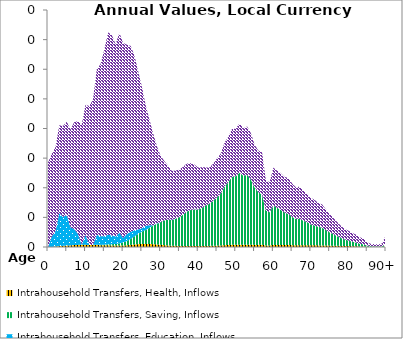
| Category | Intrahousehold Transfers, Health, Inflows | Intrahousehold Transfers, Saving, Inflows | Intrahousehold Transfers, Education, Inflows | Intrahousehold Transfers, Consumption other than health and education, Inflows |
|---|---|---|---|---|
| 0 | 0 | 0 | 0 | 57.008 |
|  | 0 | 0 | 6.996 | 56 |
| 2 | 0.304 | 0 | 10.42 | 56.77 |
| 3 | 0.58 | 0 | 22.255 | 59.377 |
| 4 | 0.795 | 0 | 19.421 | 61.508 |
| 5 | 0.945 | 0 | 20.78 | 62.879 |
| 6 | 1.107 | 0 | 12.098 | 66.08 |
| 7 | 1.302 | 0 | 10.794 | 72.364 |
| 8 | 1.428 | 0 | 7.303 | 76.206 |
| 9 | 1.516 | 0 | 0 | 81.371 |
| 10 | 1.464 | 0 | 6.757 | 87.924 |
| 11 | 1.379 | 0.012 | 0 | 93.714 |
| 12 | 1.32 | 0.086 | 0 | 98.562 |
| 13 | 1.335 | 0.176 | 6.635 | 111.996 |
| 14 | 1.219 | 0.261 | 5.818 | 116.21 |
| 15 | 1.162 | 0.426 | 5.702 | 126.046 |
| 16 | 1.146 | 0.656 | 6.451 | 136.65 |
| 17 | 1.04 | 0.88 | 5.891 | 135.256 |
| 18 | 0.927 | 1.089 | 5.091 | 129.776 |
| 19 | 0.958 | 1.483 | 7.252 | 134.942 |
| 20 | 0.986 | 2.047 | 3.089 | 131.748 |
| 21 | 1.128 | 2.874 | 4.789 | 127.779 |
| 22 | 1.422 | 4.061 | 4.749 | 125.515 |
| 23 | 1.713 | 5.453 | 4.144 | 118.094 |
| 24 | 1.927 | 6.87 | 3.127 | 106.806 |
| 25 | 2.043 | 8.339 | 2.199 | 95.618 |
| 26 | 2.002 | 9.411 | 2.874 | 81.547 |
| 27 | 1.988 | 10.897 | 1.85 | 71.392 |
| 28 | 1.919 | 12.623 | 0.034 | 62.213 |
| 29 | 1.709 | 13.852 | 0.337 | 52.073 |
| 30 | 1.479 | 15.27 | 0 | 44.852 |
| 31 | 1.24 | 16.767 | 0 | 39.969 |
| 32 | 1.023 | 17.469 | 0 | 36.294 |
| 33 | 0.842 | 17.258 | 0.267 | 32.933 |
| 34 | 0.775 | 18.349 | 0 | 32.572 |
| 35 | 0.74 | 19.373 | 0 | 32.037 |
| 36 | 0.74 | 21.199 | 0 | 32.346 |
| 37 | 0.731 | 23.184 | 0.034 | 32.455 |
| 38 | 0.703 | 24.304 | 0 | 31.588 |
| 39 | 0.681 | 24.65 | 0 | 30.257 |
| 40 | 0.671 | 24.588 | 0 | 28.394 |
| 41 | 0.708 | 25.722 | 0 | 27.378 |
| 42 | 0.735 | 27.269 | 0 | 25.75 |
| 43 | 0.76 | 28.368 | 0 | 24.565 |
| 44 | 0.833 | 30.424 | 0 | 25.106 |
| 45 | 0.926 | 32.633 | 0 | 26.22 |
| 46 | 1.036 | 34.912 | 0 | 27.13 |
| 47 | 1.231 | 39.545 | 0 | 29.611 |
| 48 | 1.354 | 42.379 | 0 | 30.637 |
| 49 | 1.487 | 45.958 | 0 | 32.19 |
| 50 | 1.519 | 46.294 | 0 | 32.035 |
| 51 | 1.592 | 48.589 | 0 | 33.393 |
| 52 | 1.524 | 46.618 | 0 | 31.966 |
| 53 | 1.575 | 47.148 | 0 | 32.656 |
| 54 | 1.527 | 44.116 | 0 | 31.361 |
| 55 | 1.434 | 38.866 | 0 | 28.84 |
| 56 | 1.428 | 35.536 | 0 | 28.128 |
| 57 | 1.473 | 33.953 | 0 | 28.416 |
| 58 | 1.074 | 23.548 | 0 | 20.564 |
| 59 | 1.071 | 22.235 | 0 | 20.392 |
| 60 | 1.36 | 26.671 | 0 | 25.555 |
| 61 | 1.353 | 25.143 | 0 | 25.11 |
| 62 | 1.352 | 23.677 | 0 | 24.796 |
| 63 | 1.326 | 21.891 | 0 | 24.146 |
| 64 | 1.332 | 21.022 | 0 | 24.238 |
| 65 | 1.252 | 19.071 | 0 | 22.64 |
| 66 | 1.204 | 17.794 | 0 | 21.402 |
| 67 | 1.254 | 17.802 | 0 | 21.689 |
| 68 | 1.221 | 16.513 | 0 | 20.267 |
| 69 | 1.204 | 15.552 | 0 | 19.219 |
| 70 | 1.166 | 14.022 | 0 | 18.03 |
| 71 | 1.151 | 13.378 | 0 | 17.247 |
| 72 | 1.09 | 12.524 | 0 | 16.011 |
| 73 | 1.095 | 11.962 | 0 | 15.677 |
| 74 | 1.01 | 10.404 | 0 | 13.879 |
| 75 | 0.936 | 8.964 | 0 | 12.296 |
| 76 | 0.881 | 7.804 | 0 | 10.972 |
| 77 | 0.812 | 6.551 | 0 | 9.528 |
| 78 | 0.745 | 5.357 | 0 | 8.218 |
| 79 | 0.678 | 4.384 | 0 | 7.192 |
| 80 | 0.635 | 3.756 | 0 | 6.639 |
| 81 | 0.559 | 3.062 | 0 | 5.912 |
| 82 | 0.487 | 2.531 | 0 | 5.327 |
| 83 | 0.376 | 1.871 | 0 | 4.338 |
| 84 | 0.313 | 1.483 | 0 | 3.794 |
| 85 | 0.173 | 0.773 | 0 | 2.197 |
| 86 | 0.113 | 0.475 | 0 | 1.507 |
| 87 | 0.106 | 0.416 | 0 | 1.476 |
| 88 | 0.085 | 0.364 | 0 | 1.298 |
| 89 | 0.117 | 0.492 | 0 | 1.886 |
| 90+ | 0.382 | 1.555 | 0 | 6.415 |